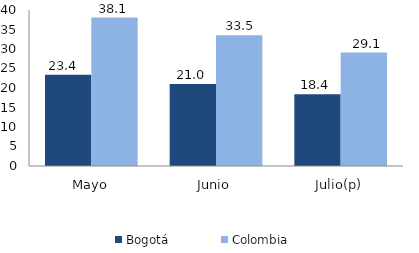
| Category | Bogotá | Colombia |
|---|---|---|
| Mayo | 23.37 | 38.053 |
| Junio | 21.035 | 33.517 |
| Julio(p) | 18.381 | 29.092 |